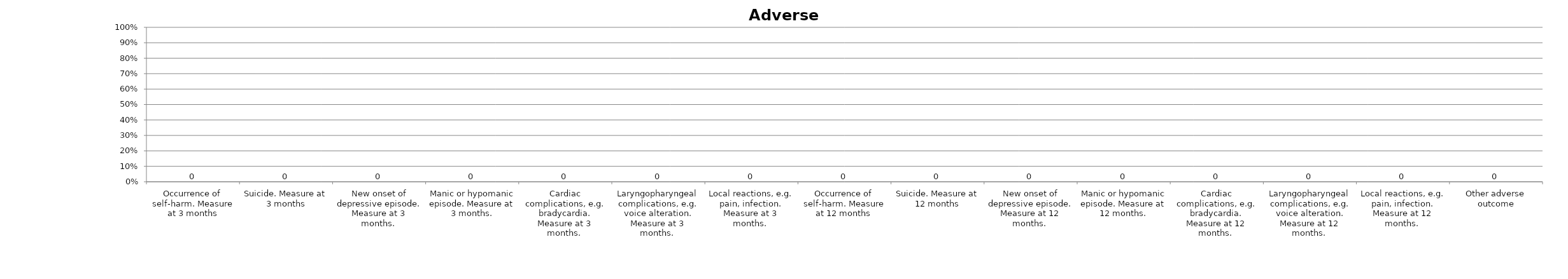
| Category | Series 0 |
|---|---|
| Occurrence of self-harm. Measure at 3 months | 0 |
| Suicide. Measure at 3 months | 0 |
| New onset of depressive episode. Measure at 3 months.  | 0 |
| Manic or hypomanic episode. Measure at 3 months. | 0 |
| Cardiac complications, e.g. bradycardia. Measure at 3 months.  | 0 |
| Laryngopharyngeal complications, e.g. voice alteration. Measure at 3 months.  | 0 |
| Local reactions, e.g. pain, infection. Measure at 3 months.  | 0 |
| Occurrence of self-harm. Measure at 12 months | 0 |
| Suicide. Measure at 12 months | 0 |
| New onset of depressive episode. Measure at 12 months.  | 0 |
| Manic or hypomanic episode. Measure at 12 months. | 0 |
| Cardiac complications, e.g. bradycardia. Measure at 12 months.  | 0 |
| Laryngopharyngeal complications, e.g. voice alteration. Measure at 12 months.  | 0 |
| Local reactions, e.g. pain, infection. Measure at 12 months.  | 0 |
| Other adverse outcome | 0 |